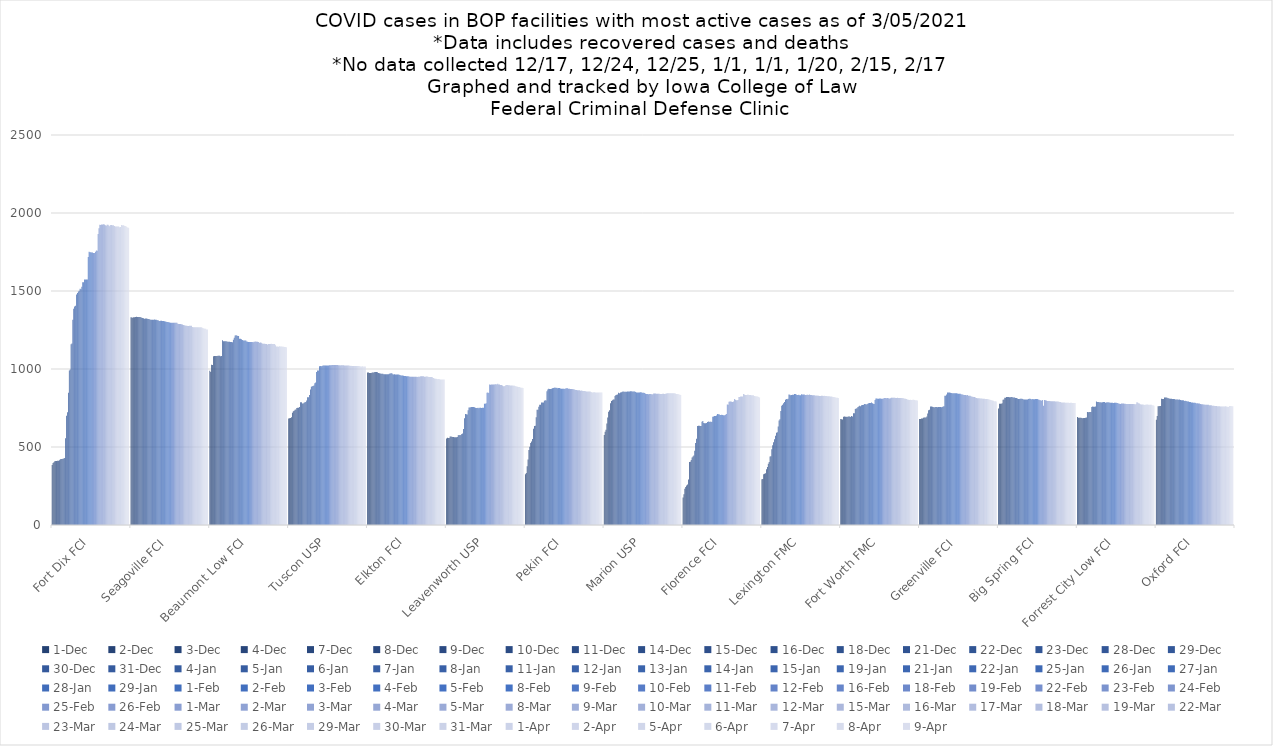
| Category | 1-Dec | 2-Dec | 3-Dec | 4-Dec | 7-Dec | 8-Dec | 9-Dec | 10-Dec | 11-Dec | 14-Dec | 15-Dec | 16-Dec | 18-Dec | 21-Dec | 22-Dec | 23-Dec | 28-Dec | 29-Dec | 30-Dec | 31-Dec | 4-Jan | 5-Jan | 6-Jan | 7-Jan | 8-Jan | 11-Jan | 12-Jan | 13-Jan | 14-Jan | 15-Jan | 19-Jan | 21-Jan | 22-Jan | 25-Jan | 26-Jan | 27-Jan | 28-Jan | 29-Jan | 1-Feb | 2-Feb | 3-Feb | 4-Feb | 5-Feb | 8-Feb | 9-Feb | 10-Feb | 11-Feb | 12-Feb | 16-Feb | 18-Feb | 19-Feb | 22-Feb | 23-Feb | 24-Feb | 25-Feb | 26-Feb | 1-Mar | 2-Mar | 3-Mar | 4-Mar | 5-Mar | 8-Mar | 9-Mar | 10-Mar | 11-Mar | 12-Mar | 15-Mar | 16-Mar | 17-Mar | 18-Mar | 19-Mar | 22-Mar | 23-Mar | 24-Mar | 25-Mar | 26-Mar | 29-Mar | 30-Mar | 31-Mar | 1-Apr | 2-Apr | 5-Apr | 6-Apr | 7-Apr | 8-Apr | 9-Apr |
|---|---|---|---|---|---|---|---|---|---|---|---|---|---|---|---|---|---|---|---|---|---|---|---|---|---|---|---|---|---|---|---|---|---|---|---|---|---|---|---|---|---|---|---|---|---|---|---|---|---|---|---|---|---|---|---|---|---|---|---|---|---|---|---|---|---|---|---|---|---|---|---|---|---|---|---|---|---|---|---|---|---|---|---|---|---|---|
| Fort Dix FCI | 385 | 398 | 402 | 408 | 410 | 411 | 412 | 412 | 415 | 421 | 423 | 423 | 424 | 427 | 430 | 556 | 700 | 723 | 847 | 991 | 997 | 1158 | 1163 | 1316 | 1387 | 1401 | 1406 | 1478 | 1487 | 1497 | 1502 | 1515 | 1512 | 1527 | 1556 | 1556 | 1574 | 1573 | 1573 | 1574 | 1718 | 1751 | 1748 | 1748 | 1747 | 1746 | 1743 | 1743 | 1751 | 1760 | 1758 | 1865 | 1902 | 1925 | 1923 | 1927 | 1927 | 1928 | 1926 | 1921 | 1918 | 1924 | 1925 | 1920 | 1915 | 1923 | 1923 | 1922 | 1922 | 1917 | 1913 | 1913 | 1913 | 1913 | 1913 | 1909 | 1910 | 1923 | 1921 | 1921 | 1918 | 1917 | 1915 | 1910 | 1906 | 1906 |
| Seagoville FCI | 1331 | 1330 | 1329 | 1332 | 1332 | 1334 | 1335 | 1334 | 1334 | 1334 | 1333 | 1331 | 1329 | 1327 | 1326 | 1322 | 1324 | 1324 | 1322 | 1321 | 1320 | 1317 | 1316 | 1315 | 1316 | 1316 | 1317 | 1316 | 1315 | 1313 | 1314 | 1308 | 1307 | 1309 | 1309 | 1308 | 1308 | 1306 | 1305 | 1303 | 1302 | 1301 | 1300 | 1298 | 1297 | 1297 | 1296 | 1297 | 1296 | 1297 | 1297 | 1297 | 1290 | 1289 | 1288 | 1288 | 1287 | 1285 | 1282 | 1281 | 1279 | 1277 | 1277 | 1275 | 1276 | 1278 | 1278 | 1278 | 1269 | 1268 | 1267 | 1268 | 1268 | 1268 | 1267 | 1267 | 1268 | 1268 | 1268 | 1264 | 1262 | 1259 | 1258 | 1258 | 1254 | 1254 |
| Beaumont Low FCI | 989 | 980 | 1027 | 1025 | 1081 | 1084 | 1084 | 1084 | 1084 | 1085 | 1085 | 1085 | 1081 | 1083 | 1184 | 1178 | 1178 | 1178 | 1178 | 1176 | 1175 | 1174 | 1175 | 1173 | 1173 | 1172 | 1187 | 1201 | 1215 | 1217 | 1214 | 1211 | 1211 | 1194 | 1194 | 1190 | 1186 | 1183 | 1182 | 1182 | 1182 | 1177 | 1174 | 1173 | 1173 | 1173 | 1173 | 1173 | 1172 | 1174 | 1174 | 1176 | 1175 | 1174 | 1173 | 1169 | 1170 | 1168 | 1163 | 1162 | 1162 | 1162 | 1161 | 1160 | 1157 | 1161 | 1161 | 1161 | 1162 | 1160 | 1160 | 1160 | 1161 | 1153 | 1145 | 1144 | 1142 | 1146 | 1145 | 1145 | 1144 | 1143 | 1142 | 1141 | 1141 | 1140 |
| Tuscon USP | 682 | 684 | 686 | 691 | 720 | 729 | 733 | 738 | 741 | 750 | 752 | 752 | 756 | 787 | 787 | 779 | 779 | 784 | 787 | 789 | 798 | 819 | 819 | 833 | 869 | 887 | 889 | 891 | 895 | 908 | 913 | 981 | 990 | 990 | 1017 | 1019 | 1018 | 1019 | 1023 | 1023 | 1023 | 1022 | 1022 | 1022 | 1023 | 1024 | 1024 | 1024 | 1025 | 1025 | 1025 | 1025 | 1025 | 1025 | 1025 | 1024 | 1024 | 1023 | 1024 | 1024 | 1024 | 1024 | 1023 | 1023 | 1022 | 1023 | 1022 | 1022 | 1020 | 1021 | 1020 | 1019 | 1019 | 1020 | 1020 | 1020 | 1019 | 1019 | 1019 | 1018 | 1016 | 1016 | 1017 | 1016 | 1016 | 1016 |
| Elkton FCI | 977 | 977 | 975 | 975 | 974 | 978 | 978 | 978 | 980 | 981 | 981 | 979 | 975 | 973 | 971 | 970 | 970 | 969 | 966 | 966 | 966 | 966 | 966 | 966 | 969 | 971 | 973 | 973 | 967 | 965 | 966 | 964 | 965 | 965 | 965 | 963 | 961 | 959 | 959 | 959 | 957 | 955 | 955 | 953 | 953 | 953 | 952 | 951 | 951 | 951 | 951 | 951 | 951 | 951 | 950 | 948 | 950 | 951 | 951 | 953 | 953 | 953 | 953 | 951 | 951 | 952 | 952 | 950 | 948 | 948 | 948 | 948 | 947 | 943 | 939 | 938 | 937 | 936 | 934 | 936 | 934 | 933 | 933 | 932 | 933 | 933 |
| Leavenworth USP | 554 | 559 | 558 | 558 | 567 | 568 | 566 | 564 | 564 | 563 | 563 | 563 | 564 | 576 | 577 | 575 | 577 | 584 | 586 | 615 | 685 | 712 | 710 | 709 | 735 | 754 | 754 | 755 | 756 | 756 | 756 | 755 | 751 | 750 | 750 | 751 | 748 | 752 | 751 | 750 | 752 | 752 | 778 | 777 | 781 | 847 | 850 | 846 | 900 | 899 | 901 | 901 | 901 | 900 | 902 | 903 | 901 | 905 | 901 | 900 | 897 | 897 | 895 | 890 | 889 | 891 | 898 | 898 | 898 | 896 | 896 | 894 | 895 | 895 | 893 | 894 | 891 | 890 | 888 | 887 | 884 | 885 | 882 | 880 | 880 | 879 |
| Pekin FCI | 326 | 333 | 376 | 420 | 480 | 502 | 526 | 536 | 552 | 617 | 635 | 636 | 690 | 739 | 739 | 758 | 771 | 771 | 786 | 786 | 785 | 796 | 800 | 798 | 858 | 868 | 873 | 871 | 872 | 874 | 876 | 879 | 880 | 881 | 879 | 880 | 877 | 878 | 879 | 875 | 874 | 873 | 873 | 873 | 872 | 876 | 876 | 876 | 874 | 873 | 872 | 871 | 871 | 870 | 870 | 867 | 865 | 865 | 864 | 864 | 863 | 861 | 862 | 860 | 859 | 859 | 859 | 857 | 856 | 855 | 855 | 855 | 855 | 852 | 850 | 850 | 851 | 851 | 850 | 849 | 849 | 849 | 849 | 849 | 850 | 850 |
| Marion USP | 577 | 597 | 611 | 650 | 689 | 726 | 736 | 781 | 795 | 799 | 804 | 805 | 827 | 833 | 835 | 836 | 847 | 845 | 850 | 851 | 854 | 855 | 854 | 854 | 854 | 854 | 856 | 856 | 855 | 857 | 858 | 855 | 855 | 855 | 855 | 853 | 850 | 850 | 850 | 850 | 851 | 851 | 848 | 848 | 848 | 846 | 841 | 840 | 839 | 838 | 839 | 839 | 839 | 836 | 838 | 843 | 843 | 843 | 842 | 841 | 841 | 841 | 840 | 839 | 840 | 841 | 841 | 840 | 841 | 843 | 845 | 845 | 845 | 845 | 845 | 845 | 845 | 845 | 844 | 843 | 840 | 840 | 840 | 837 | 835 | 834 |
| Florence FCI | 176 | 197 | 233 | 244 | 253 | 260 | 292 | 404 | 405 | 417 | 432 | 439 | 445 | 476 | 525 | 553 | 635 | 637 | 637 | 634 | 634 | 662 | 667 | 654 | 652 | 652 | 654 | 661 | 664 | 661 | 664 | 661 | 662 | 694 | 696 | 699 | 698 | 702 | 711 | 710 | 710 | 705 | 705 | 706 | 705 | 703 | 704 | 706 | 712 | 773 | 771 | 790 | 792 | 792 | 790 | 788 | 791 | 808 | 803 | 800 | 799 | 802 | 820 | 821 | 823 | 823 | 823 | 839 | 836 | 834 | 833 | 834 | 836 | 834 | 833 | 833 | 832 | 832 | 831 | 827 | 825 | 825 | 824 | 823 | 820 | 817 |
| Lexington FMC | 293 | 295 | 326 | 328 | 332 | 358 | 371 | 392 | 404 | 439 | 441 | 485 | 512 | 530 | 549 | 572 | 592 | 595 | 632 | 670 | 678 | 731 | 764 | 771 | 780 | 789 | 803 | 807 | 806 | 810 | 836 | 835 | 831 | 834 | 835 | 835 | 839 | 839 | 836 | 834 | 834 | 835 | 832 | 832 | 838 | 837 | 836 | 836 | 834 | 834 | 835 | 835 | 834 | 836 | 834 | 833 | 832 | 832 | 831 | 830 | 829 | 830 | 828 | 829 | 827 | 827 | 828 | 828 | 827 | 828 | 827 | 827 | 827 | 826 | 826 | 826 | 823 | 823 | 822 | 821 | 820 | 819 | 817 | 816 | 815 | 814 |
| Fort Worth FMC | 680 | 678 | 676 | 694 | 696 | 694 | 694 | 692 | 695 | 695 | 695 | 693 | 698 | 695 | 717 | 717 | 743 | 746 | 749 | 756 | 760 | 765 | 762 | 767 | 769 | 769 | 775 | 775 | 773 | 774 | 777 | 781 | 782 | 782 | 785 | 780 | 777 | 775 | 802 | 811 | 811 | 810 | 810 | 811 | 811 | 810 | 810 | 810 | 814 | 814 | 814 | 813 | 814 | 813 | 811 | 812 | 816 | 816 | 816 | 816 | 816 | 814 | 814 | 815 | 814 | 814 | 814 | 814 | 814 | 813 | 813 | 810 | 810 | 808 | 805 | 803 | 802 | 803 | 802 | 802 | 803 | 803 | 802 | 800 | 800 | 798 |
| Greenville FCI | 679 | 680 | 683 | 683 | 687 | 689 | 689 | 689 | 695 | 715 | 736 | 739 | 760 | 759 | 758 | 756 | 754 | 756 | 756 | 756 | 755 | 757 | 757 | 756 | 755 | 756 | 759 | 761 | 828 | 829 | 836 | 850 | 850 | 849 | 848 | 846 | 844 | 844 | 845 | 844 | 844 | 844 | 843 | 841 | 841 | 841 | 838 | 836 | 836 | 834 | 833 | 833 | 832 | 833 | 829 | 829 | 829 | 825 | 822 | 822 | 821 | 820 | 818 | 814 | 812 | 812 | 812 | 811 | 811 | 811 | 810 | 810 | 809 | 807 | 807 | 807 | 806 | 805 | 803 | 801 | 800 | 798 | 797 | 794 | 794 | 792 |
| Big Spring FCI | 746 | 777 | 777 | 777 | 781 | 803 | 804 | 815 | 815 | 820 | 820 | 820 | 819 | 819 | 820 | 820 | 818 | 818 | 818 | 814 | 814 | 811 | 808 | 807 | 810 | 810 | 809 | 807 | 805 | 804 | 804 | 804 | 805 | 807 | 809 | 809 | 807 | 804 | 807 | 806 | 806 | 807 | 807 | 807 | 804 | 803 | 800 | 800 | 797 | 801 | 765 | 801 | 800 | 798 | 795 | 795 | 795 | 795 | 794 | 793 | 793 | 793 | 793 | 792 | 792 | 791 | 791 | 790 | 789 | 788 | 786 | 786 | 785 | 785 | 783 | 783 | 783 | 783 | 783 | 782 | 783 | 783 | 782 | 782 | 782 | 782 |
| Forrest City Low FCI | 692 | 687 | 687 | 688 | 688 | 686 | 684 | 686 | 686 | 688 | 689 | 724 | 723 | 724 | 724 | 724 | 757 | 759 | 758 | 758 | 759 | 791 | 789 | 788 | 788 | 786 | 787 | 786 | 787 | 788 | 788 | 784 | 785 | 787 | 786 | 787 | 784 | 784 | 784 | 783 | 782 | 783 | 783 | 783 | 782 | 782 | 778 | 778 | 776 | 779 | 779 | 779 | 777 | 777 | 775 | 776 | 776 | 776 | 776 | 776 | 776 | 776 | 776 | 776 | 773 | 775 | 787 | 786 | 781 | 779 | 774 | 773 | 773 | 772 | 770 | 771 | 771 | 772 | 772 | 771 | 771 | 771 | 771 | 767 | 767 | 764 |
| Oxford FCI | 675 | 698 | 762 | 762 | 763 | 763 | 809 | 808 | 808 | 818 | 818 | 817 | 815 | 813 | 813 | 810 | 809 | 809 | 808 | 807 | 807 | 804 | 804 | 804 | 804 | 803 | 804 | 802 | 800 | 799 | 799 | 795 | 796 | 795 | 793 | 791 | 791 | 789 | 788 | 786 | 786 | 784 | 783 | 783 | 782 | 779 | 781 | 779 | 779 | 776 | 774 | 774 | 773 | 772 | 771 | 771 | 771 | 771 | 771 | 768 | 767 | 767 | 765 | 764 | 764 | 763 | 763 | 763 | 761 | 761 | 761 | 760 | 760 | 760 | 760 | 759 | 759 | 761 | 760 | 758 | 756 | 763 | 763 | 763 | 762 | 762 |